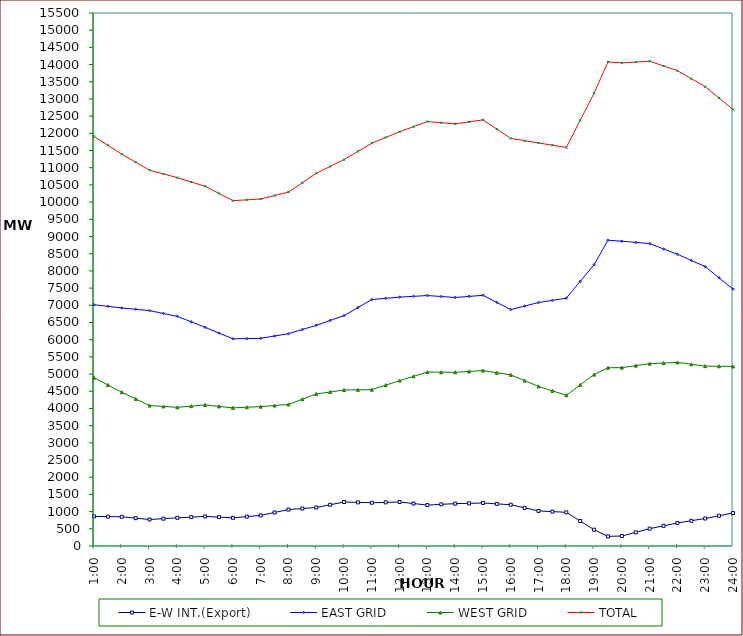
| Category | E-W INT.(Export) | EAST GRID | WEST GRID | TOTAL |
|---|---|---|---|---|
| 1:00 | 860 | 7016 | 4894 | 11910 |
| 1:30 | 855 | 6969 | 4683 | 11652 |
| 2:00 | 850 | 6922 | 4472 | 11394 |
| 2:30 | 810 | 6883.5 | 4278 | 11161.5 |
| 3:00 | 770 | 6845 | 4084 | 10929 |
| 3:30 | 795 | 6762 | 4058.5 | 10820.5 |
| 4:00 | 820 | 6679 | 4033 | 10712 |
| 4:30 | 840 | 6519 | 4067.5 | 10586.5 |
| 5:00 | 860 | 6359 | 4102 | 10461 |
| 5:30 | 840 | 6192.5 | 4059.5 | 10252 |
| 6:00 | 820 | 6026 | 4017 | 10043 |
| 6:30 | 855 | 6032 | 4035 | 10067 |
| 7:00 | 890 | 6038 | 4053 | 10091 |
| 7:30 | 975 | 6106.5 | 4085 | 10191.5 |
| 8:00 | 1060 | 6175 | 4117 | 10292 |
| 8:30 | 1090 | 6296 | 4269 | 10565 |
| 9:00 | 1120 | 6417 | 4421 | 10838 |
| 9:30 | 1200 | 6558.5 | 4479 | 11037.5 |
| 10:00 | 1280 | 6700 | 4537 | 11237 |
| 10:30 | 1269 | 6933.5 | 4541.5 | 11475 |
| 11:00 | 1258 | 7167 | 4546 | 11713 |
| 11:30 | 1269 | 7202 | 4678 | 11880 |
| 12:00 | 1280 | 7237 | 4810 | 12047 |
| 12:30 | 1235 | 7260.5 | 4934 | 12194.5 |
| 13:00 | 1190 | 7284 | 5058 | 12342 |
| 13:30 | 1211 | 7255 | 5054.5 | 12309.5 |
| 14:00 | 1232 | 7226 | 5051 | 12277 |
| 14:30 | 1241 | 7258.5 | 5076 | 12334.5 |
| 15:00 | 1250 | 7291 | 5101 | 12392 |
| 15:30 | 1225 | 7083 | 5039 | 12122 |
| 16:00 | 1200 | 6875 | 4977 | 11852 |
| 16:30 | 1110 | 6977.5 | 4809 | 11786.5 |
| 17:00 | 1020 | 7080 | 4641 | 11721 |
| 17:30 | 1000 | 7143.5 | 4512 | 11655.5 |
| 18:00 | 980 | 7207 | 4383 | 11590 |
| 18:30 | 727 | 7694.5 | 4684 | 12378.5 |
| 19:00 | 474 | 8182 | 4985 | 13167 |
| 19:30 | 280 | 8892 | 5184 | 14076 |
| 20:00 | 290 | 8863 | 5187 | 14050 |
| 20:30 | 397 | 8828.5 | 5245 | 14073.5 |
| 21:00 | 504 | 8794 | 5303 | 14097 |
| 21:30 | 587 | 8639 | 5321 | 13960 |
| 22:00 | 670 | 8484 | 5339 | 13823 |
| 22:30 | 735 | 8304.5 | 5285 | 13589.5 |
| 23:00 | 800 | 8125 | 5231 | 13356 |
| 23:30 | 880 | 7798 | 5226.5 | 13024.5 |
| 24:00 | 960 | 7471 | 5222 | 12693 |